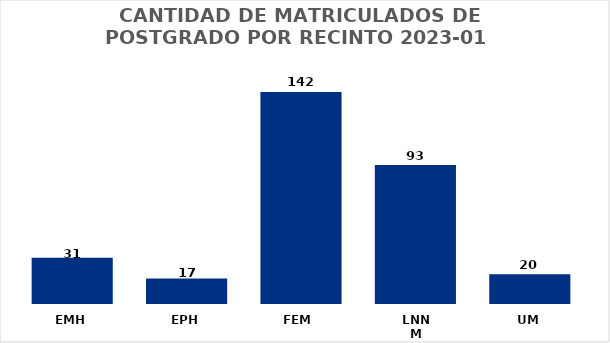
| Category | Series 0 |
|---|---|
| EMH | 31 |
| EPH | 17 |
| FEM  | 142 |
| LNNM | 93 |
| UM | 20 |